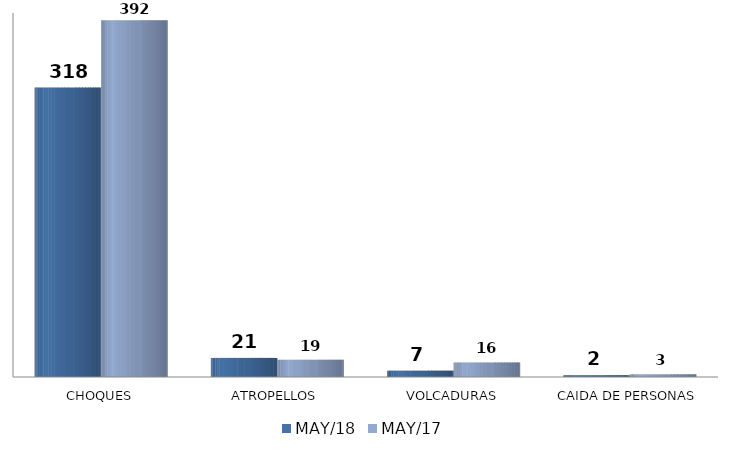
| Category | MAY/18 | MAY/17 |
|---|---|---|
| CHOQUES | 318 | 392 |
| ATROPELLOS | 21 | 19 |
| VOLCADURAS | 7 | 16 |
| CAIDA DE PERSONAS | 2 | 3 |